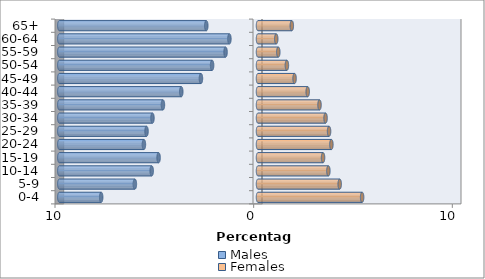
| Category | Males | Females |
|---|---|---|
| 0-4 | -7.894 | 5.241 |
| 5-9 | -6.198 | 4.112 |
| 10-14 | -5.351 | 3.543 |
| 15-19 | -5.004 | 3.274 |
| 20-24 | -5.743 | 3.694 |
| 25-29 | -5.612 | 3.577 |
| 30-34 | -5.313 | 3.401 |
| 35-39 | -4.786 | 3.097 |
| 40-44 | -3.862 | 2.502 |
| 45-49 | -2.872 | 1.84 |
| 50-54 | -2.311 | 1.454 |
| 55-59 | -1.633 | 1.022 |
| 60-64 | -1.44 | 0.918 |
| 65+ | -2.603 | 1.702 |